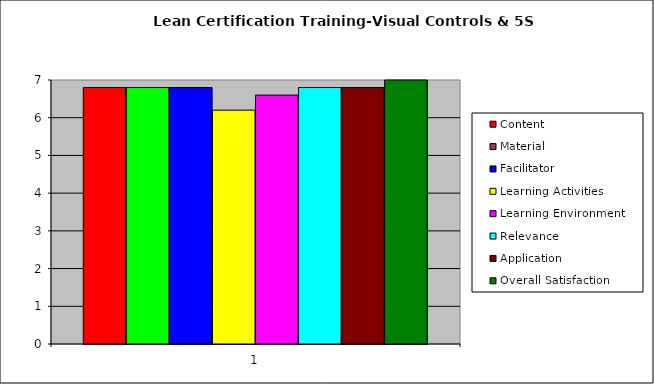
| Category | Content | Material | Facilitator | Learning Activities | Learning Environment | Relevance | Application | Overall Satisfaction |
|---|---|---|---|---|---|---|---|---|
| 0 | 6.8 | 6.8 | 6.8 | 6.2 | 6.6 | 6.8 | 6.8 | 7 |